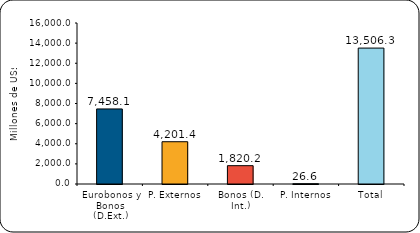
| Category | Series 1 |
|---|---|
| Eurobonos y Bonos (D.Ext.) | 7458.1 |
| P. Externos | 4201.4 |
| Bonos (D. Int.) | 1820.2 |
| P. Internos | 26.6 |
| Total | 13506.3 |